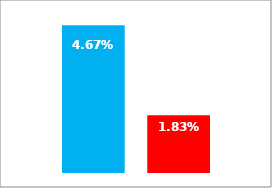
| Category | Dem | Rep |
|---|---|---|
| 0 | 0.047 | 0.018 |